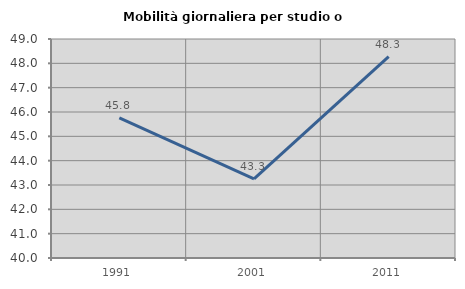
| Category | Mobilità giornaliera per studio o lavoro |
|---|---|
| 1991.0 | 45.763 |
| 2001.0 | 43.254 |
| 2011.0 | 48.279 |